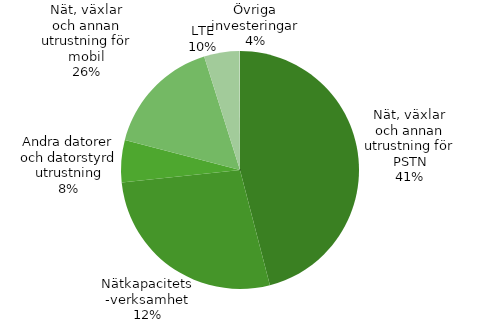
| Category | Series 0 |
|---|---|
| Nät, växlar och annan utrustning för PSTN | 5739 |
| Nätkapacitetsverksamhet | 3418 |
| Andra datorer och datorstyrd utrustning | 716 |
| Nät, växlar och annan utrustning för mobil | 2007 |
| LTE | 600 |
| Övriga investeringar | 8 |